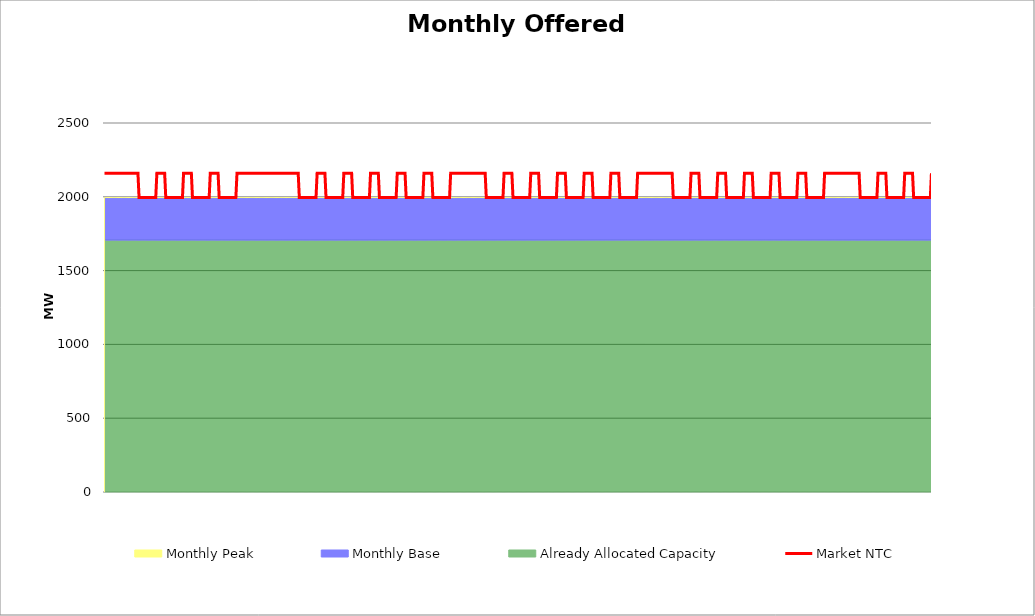
| Category | Market NTC |
|---|---|
| 0 | 2160 |
| 1 | 2160 |
| 2 | 2160 |
| 3 | 2160 |
| 4 | 2160 |
| 5 | 2160 |
| 6 | 2160 |
| 7 | 2160 |
| 8 | 2160 |
| 9 | 2160 |
| 10 | 2160 |
| 11 | 2160 |
| 12 | 2160 |
| 13 | 2160 |
| 14 | 2160 |
| 15 | 2160 |
| 16 | 2160 |
| 17 | 2160 |
| 18 | 2160 |
| 19 | 2160 |
| 20 | 2160 |
| 21 | 2160 |
| 22 | 2160 |
| 23 | 2160 |
| 24 | 2160 |
| 25 | 2160 |
| 26 | 2160 |
| 27 | 2160 |
| 28 | 2160 |
| 29 | 2160 |
| 30 | 2160 |
| 31 | 1995 |
| 32 | 1995 |
| 33 | 1995 |
| 34 | 1995 |
| 35 | 1995 |
| 36 | 1995 |
| 37 | 1995 |
| 38 | 1995 |
| 39 | 1995 |
| 40 | 1995 |
| 41 | 1995 |
| 42 | 1995 |
| 43 | 1995 |
| 44 | 1995 |
| 45 | 1995 |
| 46 | 1995 |
| 47 | 2160 |
| 48 | 2160 |
| 49 | 2160 |
| 50 | 2160 |
| 51 | 2160 |
| 52 | 2160 |
| 53 | 2160 |
| 54 | 2160 |
| 55 | 1995 |
| 56 | 1995 |
| 57 | 1995 |
| 58 | 1995 |
| 59 | 1995 |
| 60 | 1995 |
| 61 | 1995 |
| 62 | 1995 |
| 63 | 1995 |
| 64 | 1995 |
| 65 | 1995 |
| 66 | 1995 |
| 67 | 1995 |
| 68 | 1995 |
| 69 | 1995 |
| 70 | 1995 |
| 71 | 2160 |
| 72 | 2160 |
| 73 | 2160 |
| 74 | 2160 |
| 75 | 2160 |
| 76 | 2160 |
| 77 | 2160 |
| 78 | 2160 |
| 79 | 1995 |
| 80 | 1995 |
| 81 | 1995 |
| 82 | 1995 |
| 83 | 1995 |
| 84 | 1995 |
| 85 | 1995 |
| 86 | 1995 |
| 87 | 1995 |
| 88 | 1995 |
| 89 | 1995 |
| 90 | 1995 |
| 91 | 1995 |
| 92 | 1995 |
| 93 | 1995 |
| 94 | 1995 |
| 95 | 2160 |
| 96 | 2160 |
| 97 | 2160 |
| 98 | 2160 |
| 99 | 2160 |
| 100 | 2160 |
| 101 | 2160 |
| 102 | 2160 |
| 103 | 1995 |
| 104 | 1995 |
| 105 | 1995 |
| 106 | 1995 |
| 107 | 1995 |
| 108 | 1995 |
| 109 | 1995 |
| 110 | 1995 |
| 111 | 1995 |
| 112 | 1995 |
| 113 | 1995 |
| 114 | 1995 |
| 115 | 1995 |
| 116 | 1995 |
| 117 | 1995 |
| 118 | 1995 |
| 119 | 2160 |
| 120 | 2160 |
| 121 | 2160 |
| 122 | 2160 |
| 123 | 2160 |
| 124 | 2160 |
| 125 | 2160 |
| 126 | 2160 |
| 127 | 2160 |
| 128 | 2160 |
| 129 | 2160 |
| 130 | 2160 |
| 131 | 2160 |
| 132 | 2160 |
| 133 | 2160 |
| 134 | 2160 |
| 135 | 2160 |
| 136 | 2160 |
| 137 | 2160 |
| 138 | 2160 |
| 139 | 2160 |
| 140 | 2160 |
| 141 | 2160 |
| 142 | 2160 |
| 143 | 2160 |
| 144 | 2160 |
| 145 | 2160 |
| 146 | 2160 |
| 147 | 2160 |
| 148 | 2160 |
| 149 | 2160 |
| 150 | 2160 |
| 151 | 2160 |
| 152 | 2160 |
| 153 | 2160 |
| 154 | 2160 |
| 155 | 2160 |
| 156 | 2160 |
| 157 | 2160 |
| 158 | 2160 |
| 159 | 2160 |
| 160 | 2160 |
| 161 | 2160 |
| 162 | 2160 |
| 163 | 2160 |
| 164 | 2160 |
| 165 | 2160 |
| 166 | 2160 |
| 167 | 2160 |
| 168 | 2160 |
| 169 | 2160 |
| 170 | 2160 |
| 171 | 2160 |
| 172 | 2160 |
| 173 | 2160 |
| 174 | 2160 |
| 175 | 1995 |
| 176 | 1995 |
| 177 | 1995 |
| 178 | 1995 |
| 179 | 1995 |
| 180 | 1995 |
| 181 | 1995 |
| 182 | 1995 |
| 183 | 1995 |
| 184 | 1995 |
| 185 | 1995 |
| 186 | 1995 |
| 187 | 1995 |
| 188 | 1995 |
| 189 | 1995 |
| 190 | 1995 |
| 191 | 2160 |
| 192 | 2160 |
| 193 | 2160 |
| 194 | 2160 |
| 195 | 2160 |
| 196 | 2160 |
| 197 | 2160 |
| 198 | 2160 |
| 199 | 1995 |
| 200 | 1995 |
| 201 | 1995 |
| 202 | 1995 |
| 203 | 1995 |
| 204 | 1995 |
| 205 | 1995 |
| 206 | 1995 |
| 207 | 1995 |
| 208 | 1995 |
| 209 | 1995 |
| 210 | 1995 |
| 211 | 1995 |
| 212 | 1995 |
| 213 | 1995 |
| 214 | 1995 |
| 215 | 2160 |
| 216 | 2160 |
| 217 | 2160 |
| 218 | 2160 |
| 219 | 2160 |
| 220 | 2160 |
| 221 | 2160 |
| 222 | 2160 |
| 223 | 1995 |
| 224 | 1995 |
| 225 | 1995 |
| 226 | 1995 |
| 227 | 1995 |
| 228 | 1995 |
| 229 | 1995 |
| 230 | 1995 |
| 231 | 1995 |
| 232 | 1995 |
| 233 | 1995 |
| 234 | 1995 |
| 235 | 1995 |
| 236 | 1995 |
| 237 | 1995 |
| 238 | 1995 |
| 239 | 2160 |
| 240 | 2160 |
| 241 | 2160 |
| 242 | 2160 |
| 243 | 2160 |
| 244 | 2160 |
| 245 | 2160 |
| 246 | 2160 |
| 247 | 1995 |
| 248 | 1995 |
| 249 | 1995 |
| 250 | 1995 |
| 251 | 1995 |
| 252 | 1995 |
| 253 | 1995 |
| 254 | 1995 |
| 255 | 1995 |
| 256 | 1995 |
| 257 | 1995 |
| 258 | 1995 |
| 259 | 1995 |
| 260 | 1995 |
| 261 | 1995 |
| 262 | 1995 |
| 263 | 2160 |
| 264 | 2160 |
| 265 | 2160 |
| 266 | 2160 |
| 267 | 2160 |
| 268 | 2160 |
| 269 | 2160 |
| 270 | 2160 |
| 271 | 1995 |
| 272 | 1995 |
| 273 | 1995 |
| 274 | 1995 |
| 275 | 1995 |
| 276 | 1995 |
| 277 | 1995 |
| 278 | 1995 |
| 279 | 1995 |
| 280 | 1995 |
| 281 | 1995 |
| 282 | 1995 |
| 283 | 1995 |
| 284 | 1995 |
| 285 | 1995 |
| 286 | 1995 |
| 287 | 2160 |
| 288 | 2160 |
| 289 | 2160 |
| 290 | 2160 |
| 291 | 2160 |
| 292 | 2160 |
| 293 | 2160 |
| 294 | 2160 |
| 295 | 1995 |
| 296 | 1995 |
| 297 | 1995 |
| 298 | 1995 |
| 299 | 1995 |
| 300 | 1995 |
| 301 | 1995 |
| 302 | 1995 |
| 303 | 1995 |
| 304 | 1995 |
| 305 | 1995 |
| 306 | 1995 |
| 307 | 1995 |
| 308 | 1995 |
| 309 | 1995 |
| 310 | 1995 |
| 311 | 2160 |
| 312 | 2160 |
| 313 | 2160 |
| 314 | 2160 |
| 315 | 2160 |
| 316 | 2160 |
| 317 | 2160 |
| 318 | 2160 |
| 319 | 2160 |
| 320 | 2160 |
| 321 | 2160 |
| 322 | 2160 |
| 323 | 2160 |
| 324 | 2160 |
| 325 | 2160 |
| 326 | 2160 |
| 327 | 2160 |
| 328 | 2160 |
| 329 | 2160 |
| 330 | 2160 |
| 331 | 2160 |
| 332 | 2160 |
| 333 | 2160 |
| 334 | 2160 |
| 335 | 2160 |
| 336 | 2160 |
| 337 | 2160 |
| 338 | 2160 |
| 339 | 2160 |
| 340 | 2160 |
| 341 | 2160 |
| 342 | 2160 |
| 343 | 1995 |
| 344 | 1995 |
| 345 | 1995 |
| 346 | 1995 |
| 347 | 1995 |
| 348 | 1995 |
| 349 | 1995 |
| 350 | 1995 |
| 351 | 1995 |
| 352 | 1995 |
| 353 | 1995 |
| 354 | 1995 |
| 355 | 1995 |
| 356 | 1995 |
| 357 | 1995 |
| 358 | 1995 |
| 359 | 2160 |
| 360 | 2160 |
| 361 | 2160 |
| 362 | 2160 |
| 363 | 2160 |
| 364 | 2160 |
| 365 | 2160 |
| 366 | 2160 |
| 367 | 1995 |
| 368 | 1995 |
| 369 | 1995 |
| 370 | 1995 |
| 371 | 1995 |
| 372 | 1995 |
| 373 | 1995 |
| 374 | 1995 |
| 375 | 1995 |
| 376 | 1995 |
| 377 | 1995 |
| 378 | 1995 |
| 379 | 1995 |
| 380 | 1995 |
| 381 | 1995 |
| 382 | 1995 |
| 383 | 2160 |
| 384 | 2160 |
| 385 | 2160 |
| 386 | 2160 |
| 387 | 2160 |
| 388 | 2160 |
| 389 | 2160 |
| 390 | 2160 |
| 391 | 1995 |
| 392 | 1995 |
| 393 | 1995 |
| 394 | 1995 |
| 395 | 1995 |
| 396 | 1995 |
| 397 | 1995 |
| 398 | 1995 |
| 399 | 1995 |
| 400 | 1995 |
| 401 | 1995 |
| 402 | 1995 |
| 403 | 1995 |
| 404 | 1995 |
| 405 | 1995 |
| 406 | 1995 |
| 407 | 2160 |
| 408 | 2160 |
| 409 | 2160 |
| 410 | 2160 |
| 411 | 2160 |
| 412 | 2160 |
| 413 | 2160 |
| 414 | 2160 |
| 415 | 1995 |
| 416 | 1995 |
| 417 | 1995 |
| 418 | 1995 |
| 419 | 1995 |
| 420 | 1995 |
| 421 | 1995 |
| 422 | 1995 |
| 423 | 1995 |
| 424 | 1995 |
| 425 | 1995 |
| 426 | 1995 |
| 427 | 1995 |
| 428 | 1995 |
| 429 | 1995 |
| 430 | 1995 |
| 431 | 2160 |
| 432 | 2160 |
| 433 | 2160 |
| 434 | 2160 |
| 435 | 2160 |
| 436 | 2160 |
| 437 | 2160 |
| 438 | 2160 |
| 439 | 1995 |
| 440 | 1995 |
| 441 | 1995 |
| 442 | 1995 |
| 443 | 1995 |
| 444 | 1995 |
| 445 | 1995 |
| 446 | 1995 |
| 447 | 1995 |
| 448 | 1995 |
| 449 | 1995 |
| 450 | 1995 |
| 451 | 1995 |
| 452 | 1995 |
| 453 | 1995 |
| 454 | 1995 |
| 455 | 2160 |
| 456 | 2160 |
| 457 | 2160 |
| 458 | 2160 |
| 459 | 2160 |
| 460 | 2160 |
| 461 | 2160 |
| 462 | 2160 |
| 463 | 1995 |
| 464 | 1995 |
| 465 | 1995 |
| 466 | 1995 |
| 467 | 1995 |
| 468 | 1995 |
| 469 | 1995 |
| 470 | 1995 |
| 471 | 1995 |
| 472 | 1995 |
| 473 | 1995 |
| 474 | 1995 |
| 475 | 1995 |
| 476 | 1995 |
| 477 | 1995 |
| 478 | 1995 |
| 479 | 2160 |
| 480 | 2160 |
| 481 | 2160 |
| 482 | 2160 |
| 483 | 2160 |
| 484 | 2160 |
| 485 | 2160 |
| 486 | 2160 |
| 487 | 2160 |
| 488 | 2160 |
| 489 | 2160 |
| 490 | 2160 |
| 491 | 2160 |
| 492 | 2160 |
| 493 | 2160 |
| 494 | 2160 |
| 495 | 2160 |
| 496 | 2160 |
| 497 | 2160 |
| 498 | 2160 |
| 499 | 2160 |
| 500 | 2160 |
| 501 | 2160 |
| 502 | 2160 |
| 503 | 2160 |
| 504 | 2160 |
| 505 | 2160 |
| 506 | 2160 |
| 507 | 2160 |
| 508 | 2160 |
| 509 | 2160 |
| 510 | 2160 |
| 511 | 1995 |
| 512 | 1995 |
| 513 | 1995 |
| 514 | 1995 |
| 515 | 1995 |
| 516 | 1995 |
| 517 | 1995 |
| 518 | 1995 |
| 519 | 1995 |
| 520 | 1995 |
| 521 | 1995 |
| 522 | 1995 |
| 523 | 1995 |
| 524 | 1995 |
| 525 | 1995 |
| 526 | 1995 |
| 527 | 2160 |
| 528 | 2160 |
| 529 | 2160 |
| 530 | 2160 |
| 531 | 2160 |
| 532 | 2160 |
| 533 | 2160 |
| 534 | 2160 |
| 535 | 1995 |
| 536 | 1995 |
| 537 | 1995 |
| 538 | 1995 |
| 539 | 1995 |
| 540 | 1995 |
| 541 | 1995 |
| 542 | 1995 |
| 543 | 1995 |
| 544 | 1995 |
| 545 | 1995 |
| 546 | 1995 |
| 547 | 1995 |
| 548 | 1995 |
| 549 | 1995 |
| 550 | 1995 |
| 551 | 2160 |
| 552 | 2160 |
| 553 | 2160 |
| 554 | 2160 |
| 555 | 2160 |
| 556 | 2160 |
| 557 | 2160 |
| 558 | 2160 |
| 559 | 1995 |
| 560 | 1995 |
| 561 | 1995 |
| 562 | 1995 |
| 563 | 1995 |
| 564 | 1995 |
| 565 | 1995 |
| 566 | 1995 |
| 567 | 1995 |
| 568 | 1995 |
| 569 | 1995 |
| 570 | 1995 |
| 571 | 1995 |
| 572 | 1995 |
| 573 | 1995 |
| 574 | 1995 |
| 575 | 2160 |
| 576 | 2160 |
| 577 | 2160 |
| 578 | 2160 |
| 579 | 2160 |
| 580 | 2160 |
| 581 | 2160 |
| 582 | 2160 |
| 583 | 1995 |
| 584 | 1995 |
| 585 | 1995 |
| 586 | 1995 |
| 587 | 1995 |
| 588 | 1995 |
| 589 | 1995 |
| 590 | 1995 |
| 591 | 1995 |
| 592 | 1995 |
| 593 | 1995 |
| 594 | 1995 |
| 595 | 1995 |
| 596 | 1995 |
| 597 | 1995 |
| 598 | 1995 |
| 599 | 2160 |
| 600 | 2160 |
| 601 | 2160 |
| 602 | 2160 |
| 603 | 2160 |
| 604 | 2160 |
| 605 | 2160 |
| 606 | 2160 |
| 607 | 1995 |
| 608 | 1995 |
| 609 | 1995 |
| 610 | 1995 |
| 611 | 1995 |
| 612 | 1995 |
| 613 | 1995 |
| 614 | 1995 |
| 615 | 1995 |
| 616 | 1995 |
| 617 | 1995 |
| 618 | 1995 |
| 619 | 1995 |
| 620 | 1995 |
| 621 | 1995 |
| 622 | 1995 |
| 623 | 2160 |
| 624 | 2160 |
| 625 | 2160 |
| 626 | 2160 |
| 627 | 2160 |
| 628 | 2160 |
| 629 | 2160 |
| 630 | 2160 |
| 631 | 1995 |
| 632 | 1995 |
| 633 | 1995 |
| 634 | 1995 |
| 635 | 1995 |
| 636 | 1995 |
| 637 | 1995 |
| 638 | 1995 |
| 639 | 1995 |
| 640 | 1995 |
| 641 | 1995 |
| 642 | 1995 |
| 643 | 1995 |
| 644 | 1995 |
| 645 | 1995 |
| 646 | 1995 |
| 647 | 2160 |
| 648 | 2160 |
| 649 | 2160 |
| 650 | 2160 |
| 651 | 2160 |
| 652 | 2160 |
| 653 | 2160 |
| 654 | 2160 |
| 655 | 2160 |
| 656 | 2160 |
| 657 | 2160 |
| 658 | 2160 |
| 659 | 2160 |
| 660 | 2160 |
| 661 | 2160 |
| 662 | 2160 |
| 663 | 2160 |
| 664 | 2160 |
| 665 | 2160 |
| 666 | 2160 |
| 667 | 2160 |
| 668 | 2160 |
| 669 | 2160 |
| 670 | 2160 |
| 671 | 2160 |
| 672 | 2160 |
| 673 | 2160 |
| 674 | 2160 |
| 675 | 2160 |
| 676 | 2160 |
| 677 | 2160 |
| 678 | 2160 |
| 679 | 1995 |
| 680 | 1995 |
| 681 | 1995 |
| 682 | 1995 |
| 683 | 1995 |
| 684 | 1995 |
| 685 | 1995 |
| 686 | 1995 |
| 687 | 1995 |
| 688 | 1995 |
| 689 | 1995 |
| 690 | 1995 |
| 691 | 1995 |
| 692 | 1995 |
| 693 | 1995 |
| 694 | 1995 |
| 695 | 2160 |
| 696 | 2160 |
| 697 | 2160 |
| 698 | 2160 |
| 699 | 2160 |
| 700 | 2160 |
| 701 | 2160 |
| 702 | 2160 |
| 703 | 1995 |
| 704 | 1995 |
| 705 | 1995 |
| 706 | 1995 |
| 707 | 1995 |
| 708 | 1995 |
| 709 | 1995 |
| 710 | 1995 |
| 711 | 1995 |
| 712 | 1995 |
| 713 | 1995 |
| 714 | 1995 |
| 715 | 1995 |
| 716 | 1995 |
| 717 | 1995 |
| 718 | 1995 |
| 719 | 2160 |
| 720 | 2160 |
| 721 | 2160 |
| 722 | 2160 |
| 723 | 2160 |
| 724 | 2160 |
| 725 | 2160 |
| 726 | 2160 |
| 727 | 1995 |
| 728 | 1995 |
| 729 | 1995 |
| 730 | 1995 |
| 731 | 1995 |
| 732 | 1995 |
| 733 | 1995 |
| 734 | 1995 |
| 735 | 1995 |
| 736 | 1995 |
| 737 | 1995 |
| 738 | 1995 |
| 739 | 1995 |
| 740 | 1995 |
| 741 | 1995 |
| 742 | 1995 |
| 743 | 2160 |